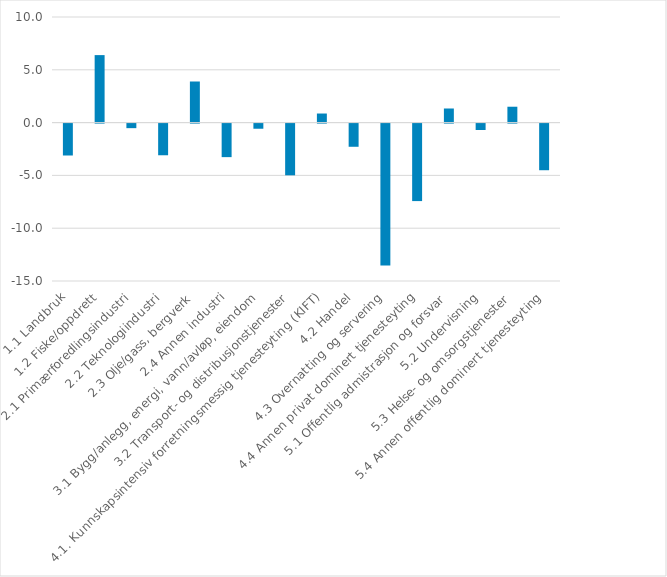
| Category | Series 0 |
|---|---|
| 1.1 Landbruk | -3.02 |
| 1.2 Fiske/oppdrett | 6.391 |
| 2.1 Primærforedlingsindustri | -0.431 |
| 2.2 Teknologiindustri | -2.998 |
| 2.3 Olje/gass, bergverk | 3.892 |
| 2.4 Annen industri | -3.175 |
| 3.1 Bygg/anlegg, energi, vann/avløp, eiendom | -0.487 |
| 3.2 Transport- og distribusjonstjenester | -4.896 |
| 4.1. Kunnskapsintensiv forretningsmessig tjenesteyting (KIFT) | 0.86 |
| 4.2 Handel | -2.194 |
| 4.3 Overnatting og servering | -13.447 |
| 4.4 Annen privat dominert tjenesteyting | -7.338 |
| 5.1 Offentlig admistrasjon og forsvar | 1.336 |
| 5.2 Undervisning | -0.607 |
| 5.3 Helse- og omsorgstjenester | 1.503 |
| 5.4 Annen offentlig dominert tjenesteyting | -4.416 |